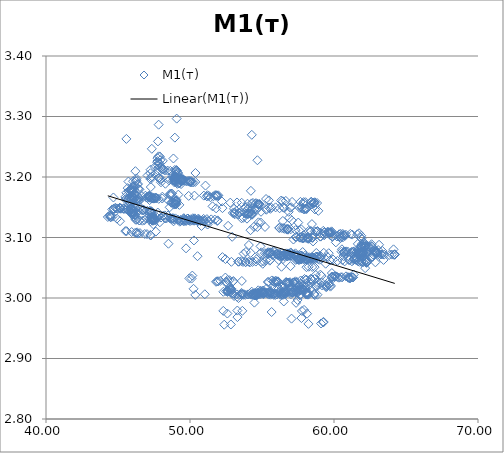
| Category | M1(т) |
|---|---|
| 47.4782104492188 | 1.562 |
| 47.8223304748535 | 3.286 |
| 47.7752113342285 | 3.259 |
| 47.9042015075684 | 3.234 |
| 47.7402610778809 | 3.231 |
| 47.8116455078125 | 3.234 |
| 48.1104316711426 | 3.227 |
| 47.9400024414063 | 3.228 |
| 47.7384796142578 | 3.226 |
| 47.8641319274902 | 3.222 |
| 47.5602607727051 | 3.217 |
| 47.7919654846191 | 3.214 |
| 47.781364440918 | 3.21 |
| 47.7717399597168 | 3.219 |
| 47.7270736694336 | 3.224 |
| 47.8446464538574 | 3.223 |
| 48.0068359375 | 3.216 |
| 48.050479888916 | 3.213 |
| 48.0594329833984 | 3.213 |
| 48.1505165100098 | 3.213 |
| 48.2072143554687 | 3.212 |
| 48.2895851135254 | 3.211 |
| 48.4586906433105 | 3.21 |
| 48.6342086791992 | 3.21 |
| 48.9484024047852 | 3.212 |
| 49.0168113708496 | 3.211 |
| 49.0652809143066 | 3.212 |
| 49.0998153686523 | 3.21 |
| 49.1643371582031 | 3.206 |
| 49.1435623168945 | 3.207 |
| 49.0636901855469 | 3.208 |
| 49.0284767150879 | 3.205 |
| 49.0110282897949 | 3.201 |
| 48.8953666687012 | 3.2 |
| 48.7631988525391 | 3.2 |
| 48.8496780395508 | 3.231 |
| 49.0629043579102 | 3.2 |
| 48.9026107788086 | 3.199 |
| 49.0445518493652 | 3.198 |
| 48.8951377868652 | 3.197 |
| 48.9089050292969 | 3.195 |
| 48.9595108032227 | 3.195 |
| 48.8071975708008 | 3.194 |
| 48.9327125549316 | 3.195 |
| 48.9280776977539 | 3.195 |
| 48.9840278625488 | 3.194 |
| 49.356273651123 | 3.193 |
| 49.2447624206543 | 3.19 |
| 49.3796463012695 | 3.188 |
| 49.2010536193848 | 3.19 |
| 49.1254501342773 | 3.189 |
| 49.0513496398926 | 3.192 |
| 48.9399909973145 | 3.193 |
| 48.9195175170898 | 3.193 |
| 48.9279365539551 | 3.191 |
| 49.0164527893066 | 3.199 |
| 48.9035606384277 | 3.2 |
| 48.959415435791 | 3.2 |
| 48.9569320678711 | 3.2 |
| 48.970645904541 | 3.2 |
| 49.0145683288574 | 3.2 |
| 49.0091552734375 | 3.201 |
| 49.1341705322266 | 3.2 |
| 49.0393905639648 | 3.199 |
| 49.0238456726074 | 3.199 |
| 49.0770149230957 | 3.198 |
| 49.1203880310059 | 3.197 |
| 49.1980819702148 | 3.196 |
| 49.2890129089355 | 3.196 |
| 49.3757286071777 | 3.197 |
| 49.4436988830566 | 3.198 |
| 49.4547424316406 | 3.196 |
| 49.4708824157715 | 3.195 |
| 49.5363121032715 | 3.195 |
| 49.5559425354004 | 3.195 |
| 49.5055389404297 | 3.195 |
| 49.4376907348633 | 3.195 |
| 49.3811721801758 | 3.194 |
| 49.4207344055176 | 3.194 |
| 49.4098472595215 | 3.195 |
| 49.4065170288086 | 3.195 |
| 49.3800315856934 | 3.193 |
| 49.4118156433105 | 3.194 |
| 49.4375114440918 | 3.193 |
| 49.5631294250488 | 3.195 |
| 49.6867408752441 | 3.194 |
| 49.767879486084 | 3.193 |
| 49.8697814941406 | 3.194 |
| 49.9816436767578 | 3.193 |
| 49.9530868530273 | 3.192 |
| 49.9929847717285 | 3.192 |
| 50.0226821899414 | 3.191 |
| 50.0557136535645 | 3.192 |
| 50.0783233642578 | 3.193 |
| 50.225959777832 | 3.191 |
| 50.1203804016113 | 3.191 |
| 50.3688583374023 | 3.192 |
| 49.3009796142578 | 3.19 |
| 48.2916946411133 | 3.189 |
| 48.0799255371094 | 3.167 |
| 47.1949615478516 | 3.162 |
| 46.3932838439941 | 3.162 |
| 46.2267150878906 | 3.162 |
| 46.0801200866699 | 3.161 |
| 45.6584587097168 | 3.162 |
| 45.7237091064453 | 3.161 |
| 45.512622833252 | 3.163 |
| 45.5086555480957 | 3.167 |
| 45.5705871582031 | 3.164 |
| 45.8847808837891 | 3.165 |
| 45.7056159973145 | 3.164 |
| 45.9650993347168 | 3.165 |
| 45.9528121948242 | 3.163 |
| 45.9915618896484 | 3.163 |
| 46.0976829528809 | 3.164 |
| 46.1201782226562 | 3.163 |
| 46.1548309326172 | 3.165 |
| 46.3209609985352 | 3.164 |
| 46.4409675598145 | 3.164 |
| 46.4696922302246 | 3.166 |
| 46.4750785827637 | 3.161 |
| 46.4192276000977 | 3.16 |
| 46.2676048278809 | 3.162 |
| 46.1051940917969 | 3.164 |
| 45.9094161987305 | 3.164 |
| 45.7662582397461 | 3.166 |
| 45.6726417541504 | 3.182 |
| 45.5823097229004 | 3.263 |
| 45.5822868347168 | 3.174 |
| 45.940185546875 | 3.169 |
| 45.9849090576172 | 3.169 |
| 46.125431060791 | 3.17 |
| 46.6593399047852 | 3.168 |
| 46.9014358520508 | 3.169 |
| 47.1791572570801 | 3.169 |
| 47.141918182373 | 3.169 |
| 47.2751693725586 | 3.168 |
| 47.194694519043 | 3.168 |
| 47.117301940918 | 3.168 |
| 47.0064811706543 | 3.167 |
| 46.9761505126953 | 3.166 |
| 47.1265411376953 | 3.167 |
| 47.165584564209 | 3.166 |
| 47.2649269104004 | 3.167 |
| 47.2057151794434 | 3.169 |
| 47.2673721313477 | 3.196 |
| 47.2508544921875 | 3.206 |
| 47.0558433532715 | 3.203 |
| 47.3575057983398 | 3.201 |
| 47.3483848571777 | 3.247 |
| 47.2624015808105 | 3.212 |
| 47.2885589599609 | 3.199 |
| 47.2763252258301 | 3.183 |
| 47.3505477905273 | 3.165 |
| 47.4623565673828 | 3.164 |
| 47.2427940368652 | 3.166 |
| 47.3565368652344 | 3.164 |
| 47.3791160583496 | 3.166 |
| 47.4531478881836 | 3.165 |
| 47.4929885864258 | 3.164 |
| 47.5062370300293 | 3.165 |
| 47.5931701660156 | 3.165 |
| 47.609733581543 | 3.166 |
| 47.6284523010254 | 3.165 |
| 47.6837539672852 | 3.165 |
| 47.8284950256348 | 3.164 |
| 47.9847373962402 | 3.191 |
| 47.8206405639648 | 3.198 |
| 47.8614234924316 | 3.198 |
| 47.9656066894531 | 3.197 |
| 47.9424209594727 | 3.195 |
| 48.5491218566895 | 3.194 |
| 45.723876953125 | 3.192 |
| 46.2806358337402 | 3.198 |
| 46.280143737793 | 3.195 |
| 46.2488632202148 | 3.193 |
| 46.0441093444824 | 3.193 |
| 46.3506774902344 | 3.188 |
| 46.1235466003418 | 3.185 |
| 46.0420608520508 | 3.184 |
| 46.0992088317871 | 3.183 |
| 46.0402336120605 | 3.148 |
| 46.2011680603027 | 3.148 |
| 45.900806427002 | 3.148 |
| 45.8478126525879 | 3.148 |
| 45.8785591125488 | 3.148 |
| 45.9586944580078 | 3.148 |
| 45.9668121337891 | 3.147 |
| 45.7226867675781 | 3.145 |
| 45.7290000915527 | 3.145 |
| 46.0446853637695 | 3.147 |
| 45.8310966491699 | 3.178 |
| 45.8725700378418 | 3.179 |
| 45.8075790405273 | 3.179 |
| 46.158748626709 | 3.178 |
| 45.8046264648438 | 3.179 |
| 46.0127754211426 | 3.178 |
| 45.7367706298828 | 3.177 |
| 45.7855682373047 | 3.176 |
| 45.9415588378906 | 3.175 |
| 45.9371376037598 | 3.178 |
| 45.9643325805664 | 3.176 |
| 46.1790885925293 | 3.172 |
| 46.0075492858887 | 3.141 |
| 46.0605316162109 | 3.143 |
| 46.1288414001465 | 3.143 |
| 46.4083595275879 | 3.144 |
| 46.0458106994629 | 3.143 |
| 45.95654296875 | 3.142 |
| 45.9712371826172 | 3.141 |
| 45.9434242248535 | 3.142 |
| 45.8794708251953 | 3.141 |
| 45.9677391052246 | 3.142 |
| 45.9633445739746 | 3.142 |
| 45.8872032165527 | 3.142 |
| 45.9403915405273 | 3.159 |
| 45.9013938903809 | 3.149 |
| 45.9834289550781 | 3.138 |
| 46.0261077880859 | 3.14 |
| 46.0449104309082 | 3.139 |
| 46.0827369689941 | 3.136 |
| 46.1400604248047 | 3.137 |
| 46.1583480834961 | 3.138 |
| 46.2024955749512 | 3.137 |
| 46.1784248352051 | 3.132 |
| 46.2221984863281 | 3.129 |
| 46.2881278991699 | 3.129 |
| 46.4824523925781 | 3.128 |
| 46.4966697692871 | 3.128 |
| 46.6974792480469 | 3.128 |
| 46.837589263916 | 3.129 |
| 47.255054473877 | 3.127 |
| 47.3602447509766 | 3.129 |
| 47.3875999450684 | 3.128 |
| 47.5115814208984 | 3.129 |
| 47.3148040771484 | 3.13 |
| 47.6245613098145 | 3.129 |
| 47.4356155395508 | 3.128 |
| 47.4749298095703 | 3.129 |
| 47.4811706542969 | 3.13 |
| 47.5076332092285 | 3.131 |
| 47.342472076416 | 3.13 |
| 47.3932151794434 | 3.132 |
| 47.4111595153809 | 3.131 |
| 47.5329170227051 | 3.133 |
| 47.3060073852539 | 3.133 |
| 47.2988319396973 | 3.134 |
| 47.2112197875977 | 3.137 |
| 47.3534049987793 | 3.139 |
| 47.3408737182617 | 3.143 |
| 47.2760353088379 | 3.143 |
| 47.290111541748 | 3.142 |
| 47.2710456848145 | 3.143 |
| 47.2861595153809 | 3.144 |
| 47.1999664306641 | 3.144 |
| 47.0336380004883 | 3.144 |
| 46.8026924133301 | 3.145 |
| 46.748477935791 | 3.146 |
| 46.7597808837891 | 3.146 |
| 46.712890625 | 3.145 |
| 46.6139755249023 | 3.146 |
| 46.5441589355469 | 3.15 |
| 46.4913101196289 | 3.18 |
| 46.4308319091797 | 3.18 |
| 46.3988189697266 | 3.181 |
| 46.3826217651367 | 3.189 |
| 46.2098388671875 | 3.21 |
| 46.1046600341797 | 3.178 |
| 45.9199180603027 | 3.179 |
| 45.9117813110352 | 3.175 |
| 45.781005859375 | 3.147 |
| 45.611873626709 | 3.147 |
| 45.5595207214355 | 3.147 |
| 45.4293518066406 | 3.147 |
| 45.3930130004883 | 3.148 |
| 45.3766479492188 | 3.147 |
| 45.2061347961426 | 3.148 |
| 45.1097259521484 | 3.149 |
| 44.9825744628906 | 3.147 |
| 45.1079597473145 | 3.149 |
| 45.1456909179687 | 3.148 |
| 45.1812515258789 | 3.149 |
| 45.1032752990723 | 3.149 |
| 44.9560966491699 | 3.148 |
| 44.8150405883789 | 3.149 |
| 44.7259101867676 | 3.147 |
| 44.8541870117188 | 3.148 |
| 44.6962127685547 | 3.147 |
| 44.5991058349609 | 3.146 |
| 44.6818542480469 | 3.166 |
| 44.6246070861816 | 3.135 |
| 44.5092239379883 | 3.134 |
| 44.4721450805664 | 3.134 |
| 44.4773101806641 | 3.137 |
| 44.4309883117676 | 3.137 |
| 44.4160804748535 | 3.135 |
| 44.2916946411133 | 3.134 |
| 44.9247627258301 | 3.131 |
| 45.1387901306152 | 3.127 |
| 45.5079345703125 | 3.111 |
| 45.6002082824707 | 3.11 |
| 45.9474830627441 | 3.109 |
| 46.1877250671387 | 3.108 |
| 46.3301010131836 | 3.109 |
| 46.2837371826172 | 3.108 |
| 46.5262107849121 | 3.107 |
| 46.3789482116699 | 3.106 |
| 46.8571815490723 | 3.106 |
| 47.0124168395996 | 3.106 |
| 47.2487411499023 | 3.104 |
| 47.2706031799316 | 3.103 |
| 47.6290588378906 | 3.11 |
| 47.7657737731934 | 3.141 |
| 47.8003768920898 | 3.136 |
| 48.2457466125488 | 3.137 |
| 48.1321296691895 | 3.136 |
| 48.4697113037109 | 3.136 |
| 48.3576011657715 | 3.131 |
| 48.5100631713867 | 3.161 |
| 48.5863609313965 | 3.15 |
| 48.6989669799805 | 3.158 |
| 48.7305755615234 | 3.158 |
| 48.7977447509766 | 3.158 |
| 48.8743782043457 | 3.157 |
| 48.9799575805664 | 3.155 |
| 49.0201454162598 | 3.155 |
| 48.8683662414551 | 3.154 |
| 49.2624702453613 | 3.154 |
| 48.9498748779297 | 3.155 |
| 49.0651206970215 | 3.155 |
| 48.9854545593262 | 3.156 |
| 48.9980773925781 | 3.158 |
| 49.031379699707 | 3.159 |
| 49.0271682739258 | 3.161 |
| 49.0509452819824 | 3.16 |
| 49.075122833252 | 3.162 |
| 49.0890617370605 | 3.204 |
| 49.0762748718262 | 3.297 |
| 48.9491424560547 | 3.265 |
| 48.7358627319336 | 3.172 |
| 48.7342987060547 | 3.172 |
| 48.6296577453613 | 3.173 |
| 48.6122665405273 | 3.171 |
| 48.0701103210449 | 3.164 |
| 48.6720924377441 | 3.169 |
| 49.1900482177734 | 3.171 |
| 49.9073028564453 | 3.169 |
| 50.3060646057129 | 3.169 |
| 51.1738815307617 | 3.168 |
| 51.3053398132324 | 3.169 |
| 51.8630180358887 | 3.169 |
| 50.9618682861328 | 3.169 |
| 51.7980003356934 | 3.169 |
| 51.9646797180176 | 3.17 |
| 51.7495651245117 | 3.17 |
| 51.9320640563965 | 3.169 |
| 51.8450202941895 | 3.17 |
| 51.6319274902344 | 3.168 |
| 51.4219436645508 | 3.167 |
| 51.2107124328613 | 3.17 |
| 51.0759429931641 | 3.186 |
| 50.3788223266602 | 3.207 |
| 47.2013397216797 | 3.141 |
| 48.9919395446777 | 3.132 |
| 48.8567161560059 | 3.127 |
| 49.2892417907715 | 3.126 |
| 49.6769714355469 | 3.13 |
| 50.6555671691895 | 3.129 |
| 50.7278327941895 | 3.127 |
| 51.0354461669922 | 3.128 |
| 50.9298248291016 | 3.128 |
| 50.7816162109375 | 3.128 |
| 50.4515113830566 | 3.128 |
| 49.9103736877441 | 3.129 |
| 49.9230651855469 | 3.128 |
| 49.1578826904297 | 3.129 |
| 49.346981048584 | 3.129 |
| 49.1587219238281 | 3.129 |
| 48.7436485290527 | 3.131 |
| 48.8786201477051 | 3.13 |
| 48.6892356872559 | 3.131 |
| 48.5823936462402 | 3.132 |
| 48.223991394043 | 3.133 |
| 47.9829711914063 | 3.133 |
| 47.7403945922852 | 3.132 |
| 47.4386978149414 | 3.133 |
| 47.3333549499512 | 3.134 |
| 47.457160949707 | 3.132 |
| 47.6239624023438 | 3.13 |
| 47.9048233032227 | 3.125 |
| 47.4526405334473 | 3.122 |
| 47.5276222229004 | 3.13 |
| 46.9756050109863 | 3.131 |
| 47.1920509338379 | 3.13 |
| 47.4232788085937 | 3.132 |
| 47.4127540588379 | 3.132 |
| 48.281551361084 | 3.132 |
| 48.7762603759766 | 3.132 |
| 48.8416938781738 | 3.132 |
| 49.5658111572266 | 3.132 |
| 49.8238792419434 | 3.131 |
| 50.3262748718262 | 3.132 |
| 50.5812225341797 | 3.131 |
| 50.9444122314453 | 3.131 |
| 51.1765899658203 | 3.13 |
| 51.473762512207 | 3.13 |
| 51.7206268310547 | 3.13 |
| 51.9245643615723 | 3.128 |
| 51.8938369750977 | 3.127 |
| 51.2842712402344 | 3.126 |
| 51.2522926330566 | 3.127 |
| 50.9364624023438 | 3.127 |
| 50.573558807373 | 3.128 |
| 50.2880325317383 | 3.128 |
| 50.1191558837891 | 3.128 |
| 50.0021095275879 | 3.127 |
| 49.6889762878418 | 3.128 |
| 49.5815734863281 | 3.129 |
| 49.4728164672852 | 3.128 |
| 49.3493194580078 | 3.127 |
| 49.5764427185059 | 3.127 |
| 49.6045112609863 | 3.13 |
| 49.5743293762207 | 3.132 |
| 49.8595695495605 | 3.131 |
| 50.1966896057129 | 3.132 |
| 50.0473022460937 | 3.13 |
| 50.3399620056152 | 3.131 |
| 50.173828125 | 3.13 |
| 50.2882385253906 | 3.13 |
| 50.3403930664063 | 3.129 |
| 50.5696487426758 | 3.129 |
| 49.7470092773438 | 3.128 |
| 50.5609741210937 | 3.127 |
| 50.2754783630371 | 3.095 |
| 50.1610794067383 | 3.037 |
| 49.9550819396973 | 3.032 |
| 50.1099243164063 | 3.032 |
| 49.7251586914063 | 3.082 |
| 50.4470405578613 | 3.128 |
| 51.5640106201172 | 3.152 |
| 52.2218246459961 | 3.159 |
| 52.796703338623 | 3.158 |
| 53.2655715942383 | 3.158 |
| 53.5891609191895 | 3.157 |
| 53.9929733276367 | 3.156 |
| 54.271671295166 | 3.156 |
| 54.3704681396484 | 3.157 |
| 54.5441360473633 | 3.156 |
| 54.5790061950684 | 3.157 |
| 54.6987342834473 | 3.156 |
| 54.7808074951172 | 3.155 |
| 54.8178024291992 | 3.156 |
| 54.814266204834 | 3.155 |
| 54.802619934082 | 3.155 |
| 54.7728233337402 | 3.155 |
| 54.7382354736328 | 3.155 |
| 54.6818084716797 | 3.228 |
| 54.2914237976074 | 3.27 |
| 54.2267761230469 | 3.177 |
| 53.9575080871582 | 3.131 |
| 53.7060241699219 | 3.133 |
| 53.5766296386719 | 3.132 |
| 53.4465484619141 | 3.141 |
| 53.3247337341309 | 3.138 |
| 53.1013526916504 | 3.138 |
| 53.2213821411133 | 3.144 |
| 52.9735374450684 | 3.141 |
| 53.1030654907227 | 3.141 |
| 53.4085388183594 | 3.141 |
| 53.798641204834 | 3.14 |
| 53.9057006835937 | 3.139 |
| 53.9890632629395 | 3.139 |
| 54.1187133789063 | 3.14 |
| 54.3423118591309 | 3.138 |
| 54.3001594543457 | 3.138 |
| 54.2422637939453 | 3.139 |
| 54.2430763244629 | 3.139 |
| 54.1353225708008 | 3.14 |
| 54.0675277709961 | 3.139 |
| 54.1364440917969 | 3.14 |
| 54.2366180419922 | 3.146 |
| 54.1801605224609 | 3.144 |
| 54.2023735046387 | 3.112 |
| 53.636775970459 | 2.979 |
| 53.2875213623047 | 2.979 |
| 53.2934303283691 | 2.968 |
| 53.3687858581543 | 3 |
| 52.9014129638672 | 3.008 |
| 52.8098373413086 | 3.01 |
| 52.87646484375 | 3.013 |
| 52.8562889099121 | 3.015 |
| 52.8534049987793 | 3.015 |
| 52.8054847717285 | 3.014 |
| 52.7971687316895 | 3.015 |
| 52.7065773010254 | 3.014 |
| 52.6003608703613 | 3.013 |
| 52.5784606933594 | 3.012 |
| 52.5891532897949 | 3.012 |
| 52.5976333618164 | 3.012 |
| 52.6642112731934 | 3.011 |
| 52.6020164489746 | 3.01 |
| 52.5080299377441 | 3.011 |
| 52.4567375183105 | 3.034 |
| 52.4619941711426 | 3.064 |
| 52.3172950744629 | 3.01 |
| 52.3125915527344 | 2.979 |
| 52.3766937255859 | 2.956 |
| 52.8386726379395 | 2.956 |
| 52.5945129394531 | 2.974 |
| 52.2522010803223 | 3.068 |
| 53.0953025817871 | 3.14 |
| 53.0562973022461 | 3.147 |
| 53.8182640075684 | 3.149 |
| 54.6601943969727 | 3.147 |
| 55.270809173584 | 3.147 |
| 55.5819664001465 | 3.147 |
| 56.2224197387695 | 3.148 |
| 56.45458984375 | 3.15 |
| 56.5417022705078 | 3.149 |
| 56.9538497924805 | 3.149 |
| 57.6091079711914 | 3.149 |
| 57.9898910522461 | 3.148 |
| 58.0736541748047 | 3.147 |
| 57.7571411132813 | 3.148 |
| 58.1044120788574 | 3.147 |
| 57.9506416320801 | 3.147 |
| 58.0584259033203 | 3.147 |
| 57.8884887695313 | 3.147 |
| 58.6767196655273 | 3.146 |
| 58.9127616882324 | 3.144 |
| 55.3049163818359 | 3.146 |
| 54.5306663513184 | 3.148 |
| 54.0073318481445 | 3.147 |
| 52.2546501159668 | 3.149 |
| 51.8141098022461 | 3.148 |
| 51.2193069458008 | 3.121 |
| 50.7974319458008 | 3.119 |
| 52.6465492248535 | 3.119 |
| 54.4428291320801 | 3.118 |
| 55.2083625793457 | 3.117 |
| 56.2258415222168 | 3.116 |
| 56.1901512145996 | 3.116 |
| 56.3836631774902 | 3.116 |
| 56.5009460449219 | 3.115 |
| 56.5595893859863 | 3.114 |
| 56.7742614746094 | 3.114 |
| 56.6796913146973 | 3.114 |
| 56.8221588134766 | 3.114 |
| 56.7472457885742 | 3.113 |
| 56.8115615844727 | 3.113 |
| 56.9989967346191 | 3.114 |
| 57.332820892334 | 3.112 |
| 57.5811080932617 | 3.112 |
| 57.7308883666992 | 3.114 |
| 58.2384452819824 | 3.111 |
| 58.3778610229492 | 3.111 |
| 58.4077491760254 | 3.11 |
| 58.663272857666 | 3.11 |
| 58.7464790344238 | 3.109 |
| 58.8181304931641 | 3.11 |
| 59.0575408935547 | 3.107 |
| 58.8530197143555 | 3.111 |
| 59.2578163146973 | 3.111 |
| 59.3340454101562 | 3.109 |
| 59.8261184692383 | 3.11 |
| 59.5605316162109 | 3.11 |
| 59.8685035705566 | 3.109 |
| 59.587703704834 | 3.109 |
| 59.7425880432129 | 3.108 |
| 59.6309318542481 | 3.108 |
| 59.7789688110352 | 3.108 |
| 59.6446075439453 | 3.108 |
| 59.821849822998 | 3.108 |
| 59.6524429321289 | 3.107 |
| 59.325870513916 | 3.108 |
| 60.4539756774902 | 3.106 |
| 60.3664207458496 | 3.105 |
| 60.6117782592773 | 3.106 |
| 60.6402244567871 | 3.104 |
| 60.8291969299316 | 3.105 |
| 60.75439453125 | 3.103 |
| 60.7119255065918 | 3.104 |
| 60.3546371459961 | 3.101 |
| 59.8779373168945 | 3.101 |
| 59.7641143798828 | 3.103 |
| 59.3298034667969 | 3.104 |
| 59.0797843933105 | 3.102 |
| 59.0423240661621 | 3.102 |
| 58.5076637268066 | 3.099 |
| 57.878360748291 | 3.099 |
| 57.639835357666 | 3.1 |
| 57.6092414855957 | 3.1 |
| 57.3402633666992 | 3.1 |
| 57.3757820129395 | 3.101 |
| 57.680248260498 | 3.1 |
| 57.8733558654785 | 3.099 |
| 58.0662689208984 | 3.099 |
| 58.2226867675781 | 3.1 |
| 58.2494316101074 | 3.098 |
| 58.1897583007812 | 3.098 |
| 58.1928024291992 | 3.101 |
| 57.5182456970215 | 3.125 |
| 57.0738754272461 | 3.128 |
| 56.8851547241211 | 3.133 |
| 56.4468383789063 | 3.127 |
| 55.6505546569824 | 3.149 |
| 55.2807540893555 | 3.164 |
| 55.4799880981445 | 3.161 |
| 56.3276252746582 | 3.161 |
| 56.4358558654785 | 3.16 |
| 56.6535263061523 | 3.161 |
| 57.0898551940918 | 3.159 |
| 57.6726760864258 | 3.159 |
| 57.8398895263672 | 3.157 |
| 58.0209426879883 | 3.158 |
| 57.8940925598145 | 3.159 |
| 58.4392280578613 | 3.159 |
| 58.4286117553711 | 3.159 |
| 58.3974227905273 | 3.159 |
| 58.6055488586426 | 3.156 |
| 58.5461006164551 | 3.157 |
| 58.6145782470703 | 3.157 |
| 58.6639289855957 | 3.158 |
| 58.8251686096191 | 3.157 |
| 58.4490051269531 | 3.155 |
| 58.6579322814941 | 3.152 |
| 57.7144737243652 | 3.151 |
| 57.0273818969727 | 3.15 |
| 55.9461517333984 | 3.15 |
| 55.4900283813477 | 3.15 |
| 54.737232208252 | 3.15 |
| 54.0837669372559 | 3.149 |
| 53.8386993408203 | 3.15 |
| 54.0881576538086 | 3.088 |
| 53.7238922119141 | 3.073 |
| 53.8798141479492 | 3.076 |
| 54.2118530273438 | 3.075 |
| 54.8770523071289 | 3.074 |
| 54.9505844116211 | 3.075 |
| 55.2002258300781 | 3.074 |
| 56.0764045715332 | 3.074 |
| 56.3832473754883 | 3.074 |
| 56.69677734375 | 3.074 |
| 57.3251266479492 | 3.074 |
| 57.8225746154785 | 3.076 |
| 58.771728515625 | 3.074 |
| 59.2884941101074 | 3.075 |
| 59.6353302001953 | 3.074 |
| 60.5512390136719 | 3.08 |
| 61.1375389099121 | 3.106 |
| 61.2633361816406 | 3.105 |
| 61.6250228881836 | 3.105 |
| 61.7374725341797 | 3.107 |
| 61.8502388000488 | 3.1 |
| 61.8913154602051 | 3.103 |
| 61.913013458252 | 3.098 |
| 62.0141487121582 | 3.069 |
| 61.6909713745117 | 3.061 |
| 61.5430870056152 | 3.063 |
| 61.3495063781738 | 3.064 |
| 61.4289093017578 | 3.064 |
| 61.5302925109863 | 3.063 |
| 61.3354797363281 | 3.062 |
| 61.0535087585449 | 3.063 |
| 61.0424842834473 | 3.063 |
| 60.5799140930176 | 3.063 |
| 60.2351531982422 | 3.061 |
| 59.9173164367676 | 3.035 |
| 59.2705078125 | 2.961 |
| 59.2563400268555 | 2.96 |
| 59.1032104492188 | 2.958 |
| 58.2248497009277 | 2.957 |
| 57.7389717102051 | 2.967 |
| 57.9195213317871 | 2.98 |
| 57.7732620239258 | 2.979 |
| 57.3672332763672 | 2.992 |
| 55.6682929992676 | 2.977 |
| 55.4099960327148 | 3.622 |
| 54.9652900695801 | 3.739 |
| 54.6056861877441 | 3.731 |
| 54.5088310241699 | 3.453 |
| 54.625415802002 | 3.064 |
| 54.1594848632812 | 3.059 |
| 54.0761756896973 | 3.06 |
| 53.680061340332 | 3.06 |
| 52.8745079040527 | 3.06 |
| 53.3495407104492 | 3.06 |
| 53.5702247619629 | 3.061 |
| 53.3876457214355 | 3.06 |
| 53.8761177062988 | 3.059 |
| 53.8491172790527 | 3.059 |
| 54.3374443054199 | 3.06 |
| 54.5734825134277 | 3.06 |
| 54.9422874450684 | 3.06 |
| 55.1029586791992 | 3.06 |
| 55.2853927612305 | 3.062 |
| 55.5381851196289 | 3.062 |
| 55.5675506591797 | 3.063 |
| 56.1635932922363 | 3.063 |
| 56.4514083862305 | 3.064 |
| 55.8229446411133 | 3.078 |
| 55.836669921875 | 3.076 |
| 55.4282569885254 | 3.076 |
| 55.6557693481445 | 3.075 |
| 55.5695571899414 | 3.075 |
| 55.5532989501953 | 3.075 |
| 55.4085807800293 | 3.075 |
| 55.3478393554687 | 3.074 |
| 55.3581199645996 | 3.073 |
| 55.5384140014648 | 3.074 |
| 56.033576965332 | 3.073 |
| 56.2153015136719 | 3.073 |
| 56.0153350830078 | 3.073 |
| 55.7876930236816 | 3.072 |
| 55.7300186157227 | 3.071 |
| 55.7105751037598 | 3.071 |
| 56.0815124511719 | 3.072 |
| 56.7292060852051 | 3.072 |
| 56.8649978637695 | 3.071 |
| 56.9388771057129 | 3.072 |
| 56.9309158325195 | 3.072 |
| 57.5247611999512 | 3.071 |
| 57.1846122741699 | 3.072 |
| 57.2136116027832 | 3.071 |
| 57.2305297851562 | 3.071 |
| 57.0012969970703 | 3.07 |
| 57.1636505126953 | 3.072 |
| 56.9916763305664 | 3.07 |
| 56.9667053222656 | 3.074 |
| 56.9146766662598 | 3.072 |
| 56.8062324523926 | 3.074 |
| 56.8718414306641 | 3.071 |
| 56.4951171875 | 3.071 |
| 56.3837432861328 | 3.07 |
| 56.4902763366699 | 3.07 |
| 56.1052665710449 | 3.071 |
| 56.3112754821777 | 3.07 |
| 56.4707984924316 | 3.071 |
| 56.7386894226074 | 3.07 |
| 56.7495536804199 | 3.069 |
| 56.1929779052734 | 3.07 |
| 56.3737297058105 | 3.069 |
| 56.3386650085449 | 3.069 |
| 56.2834587097168 | 3.068 |
| 56.5695991516113 | 3.069 |
| 56.6014137268066 | 3.073 |
| 57.0011749267578 | 3.075 |
| 56.7713508605957 | 3.072 |
| 56.8839874267578 | 3.07 |
| 56.7653846740723 | 3.069 |
| 56.9931755065918 | 3.069 |
| 57.4247016906738 | 3.068 |
| 57.3423461914063 | 3.071 |
| 57.3014907836914 | 3.07 |
| 57.7052574157715 | 3.07 |
| 57.8076286315918 | 3.069 |
| 57.9786071777344 | 3.07 |
| 58.150260925293 | 3.068 |
| 57.7864837646484 | 3.068 |
| 58.2709274291992 | 3.067 |
| 58.8800392150879 | 3.068 |
| 58.7906723022461 | 3.069 |
| 59.0972633361816 | 3.068 |
| 59.5324096679688 | 3.068 |
| 58.7679290771484 | 3.069 |
| 58.4842758178711 | 3.068 |
| 59.0156478881836 | 3.067 |
| 58.5964431762695 | 3.067 |
| 58.4866981506348 | 3.067 |
| 58.8242416381836 | 3.067 |
| 58.6157073974609 | 3.065 |
| 58.3076934814453 | 3.065 |
| 58.7022132873535 | 3.065 |
| 58.5526275634766 | 3.064 |
| 58.4527397155762 | 3.065 |
| 58.1327438354492 | 3.064 |
| 57.7172470092773 | 3.064 |
| 57.5981788635254 | 3.064 |
| 57.5648536682129 | 3.063 |
| 57.5044631958008 | 3.064 |
| 57.3470764160156 | 3.063 |
| 57.3937759399414 | 3.064 |
| 57.4754981994629 | 3.065 |
| 57.6540107727051 | 3.064 |
| 57.7629928588867 | 3.064 |
| 57.8101119995117 | 3.065 |
| 57.903434753418 | 3.064 |
| 58.0349807739258 | 3.065 |
| 58.0237770080566 | 3.066 |
| 58.1866226196289 | 3.065 |
| 58.241382598877 | 3.064 |
| 58.122917175293 | 3.063 |
| 57.9742279052734 | 3.065 |
| 57.4836692810059 | 3.065 |
| 57.5296669006348 | 3.066 |
| 57.6564025878906 | 3.064 |
| 57.7387504577637 | 3.064 |
| 58.3956718444824 | 3.064 |
| 58.9021987915039 | 3.064 |
| 58.9983901977539 | 3.063 |
| 59.4208717346191 | 3.057 |
| 59.7207260131836 | 3.062 |
| 60.7378616333008 | 3.06 |
| 61.2460899353027 | 3.061 |
| 61.7710914611816 | 3.06 |
| 61.6741104125977 | 3.061 |
| 62.036792755127 | 3.059 |
| 62.2424774169922 | 3.06 |
| 62.2590103149414 | 3.058 |
| 62.1446914672852 | 3.06 |
| 61.9154167175293 | 3.061 |
| 62.3232612609863 | 3.06 |
| 62.8731689453125 | 3.059 |
| 62.3220596313477 | 3.061 |
| 62.1789321899414 | 3.061 |
| 62.2348899841309 | 3.059 |
| 62.2377471923828 | 3.059 |
| 62.16455078125 | 3.049 |
| 57.7273902893066 | 3.07 |
| 48.5026397705078 | 3.09 |
| 50.5230674743652 | 3.069 |
| 50.245433807373 | 3.015 |
| 50.3673706054687 | 3.005 |
| 53.0615692138672 | 3.003 |
| 53.2785835266113 | 3.002 |
| 54.4718551635742 | 2.992 |
| 56.5138206481934 | 2.994 |
| 56.1071243286133 | 3.018 |
| 56.746654510498 | 3.023 |
| 56.8275146484375 | 3.025 |
| 57.1919136047363 | 3.025 |
| 56.900318145752 | 3.025 |
| 56.767520904541 | 3.025 |
| 56.6628837585449 | 3.026 |
| 55.9202117919922 | 3.026 |
| 56.1373558044434 | 3.026 |
| 56.6780090332031 | 3.027 |
| 57.3230018615723 | 3.028 |
| 58.084644317627 | 3.03 |
| 58.4423637390137 | 3.031 |
| 58.643684387207 | 3.031 |
| 58.4489097595215 | 3.031 |
| 58.390926361084 | 3.032 |
| 57.9536476135254 | 3.031 |
| 58.0439529418945 | 3.03 |
| 58.4663734436035 | 3.122 |
| 58.5469245910644 | 3.094 |
| 57.4708061218262 | 2.997 |
| 57.6291656494141 | 3.004 |
| 57.8117599487305 | 3.015 |
| 57.8799095153809 | 3.015 |
| 57.655158996582 | 3.014 |
| 57.4735221862793 | 3.013 |
| 57.6585693359375 | 3.013 |
| 57.5553741455078 | 3.013 |
| 57.6846046447754 | 3.013 |
| 57.6134033203125 | 3.013 |
| 57.428466796875 | 3.013 |
| 57.6904945373535 | 3.014 |
| 57.9682121276855 | 3.013 |
| 57.8877983093262 | 3.013 |
| 56.9548721313477 | 3.013 |
| 56.5726585388184 | 3.011 |
| 56.5408134460449 | 3.012 |
| 55.8242225646973 | 3.016 |
| 55.3193550109863 | 3.016 |
| 54.7420768737793 | 3.013 |
| 54.8987655639648 | 3.011 |
| 55.1062469482422 | 3.012 |
| 54.8986549377441 | 3.085 |
| 54.9114379882812 | 3.125 |
| 54.7528800964355 | 3.125 |
| 54.9309463500977 | 3.143 |
| 55.0547256469727 | 3.057 |
| 54.8768730163574 | 3.011 |
| 55.0351219177246 | 3.012 |
| 54.964038848877 | 3.009 |
| 54.9981651306152 | 3.009 |
| 55.1045188903809 | 3.008 |
| 55.1633834838867 | 3.009 |
| 55.1906089782715 | 3.008 |
| 55.1206359863281 | 3.009 |
| 54.858226776123 | 3.009 |
| 54.8016777038574 | 3.007 |
| 55.0743865966797 | 3.008 |
| 55.0991859436035 | 3.007 |
| 55.3822059631348 | 3.008 |
| 55.5387802124023 | 3.008 |
| 55.6477279663086 | 3.008 |
| 55.722728729248 | 3.007 |
| 55.4828834533691 | 3.009 |
| 55.57958984375 | 3.008 |
| 55.3636016845703 | 3.008 |
| 54.9936103820801 | 3.008 |
| 54.7011184692383 | 3.008 |
| 54.4876441955566 | 3.008 |
| 54.2864608764648 | 3.01 |
| 54.1471977233887 | 3.007 |
| 54.491397857666 | 3.006 |
| 54.3900413513184 | 3.006 |
| 53.8360862731934 | 3.005 |
| 54.0140724182129 | 3.006 |
| 54.0109939575195 | 3.006 |
| 54.3550415039063 | 3.007 |
| 54.3007125854492 | 3.006 |
| 54.7925720214844 | 3.007 |
| 55.0987205505371 | 3.006 |
| 54.5462036132812 | 3.007 |
| 54.2562484741211 | 3.006 |
| 54.5475082397461 | 3.007 |
| 54.4306259155273 | 3.005 |
| 54.5516967773438 | 3.006 |
| 54.5555801391602 | 3.006 |
| 54.6141891479492 | 3.005 |
| 54.6595687866211 | 3.005 |
| 54.6318969726562 | 3.008 |
| 54.6606407165527 | 3.005 |
| 54.6213645935059 | 3.005 |
| 54.5147705078125 | 3.004 |
| 54.3888244628906 | 3.006 |
| 54.9152603149414 | 3.007 |
| 55.8122711181641 | 3.007 |
| 56.4532470703125 | 3.005 |
| 55.8677368164063 | 3.007 |
| 51.0283050537109 | 3.006 |
| 52.9763259887695 | 3.007 |
| 53.4563941955566 | 3.006 |
| 53.575382232666 | 3.006 |
| 53.6410293579102 | 3.006 |
| 53.7396659851074 | 3.006 |
| 53.2616539001465 | 3.006 |
| 53.7017402648926 | 3.005 |
| 54.3424644470215 | 3.005 |
| 54.5936164855957 | 3.006 |
| 55.8178024291992 | 3.005 |
| 56.384765625 | 3.008 |
| 56.8584403991699 | 3.01 |
| 56.4827270507812 | 3.008 |
| 56.3179092407227 | 3.011 |
| 56.4693222045898 | 3.016 |
| 56.8861465454102 | 3.021 |
| 56.8537139892578 | 3.142 |
| 56.9781036376953 | 3.053 |
| 57.0960922241211 | 3.009 |
| 56.9517974853516 | 3.009 |
| 57.132381439209 | 3.01 |
| 57.5577163696289 | 3.011 |
| 57.4964218139648 | 3.01 |
| 57.3693771362305 | 3.011 |
| 57.0617942810059 | 3.009 |
| 56.6300849914551 | 3.01 |
| 56.4368286132812 | 3.009 |
| 56.5530586242676 | 3.01 |
| 56.4020347595215 | 3.01 |
| 57.3737144470215 | 3.009 |
| 57.1687240600586 | 3.01 |
| 57.2287406921387 | 3.01 |
| 58.0341644287109 | 3.008 |
| 58.0566520690918 | 3.009 |
| 58.1105308532715 | 3.009 |
| 58.1238479614258 | 3.007 |
| 57.983154296875 | 3.019 |
| 58.0410499572754 | 3.015 |
| 56.6484107971191 | 3.007 |
| 57.0116424560547 | 3.006 |
| 56.7531051635742 | 3.011 |
| 56.4407844543457 | 3.006 |
| 56.274055480957 | 3.005 |
| 55.593433380127 | 3.005 |
| 55.4579772949219 | 3.006 |
| 55.9242401123047 | 3.005 |
| 56.2736701965332 | 3.007 |
| 56.3751983642578 | 3.005 |
| 56.0390930175781 | 3.006 |
| 56.558235168457 | 3.007 |
| 57.6467475891113 | 3.005 |
| 58.0675582885742 | 3.006 |
| 58.1367835998535 | 3.007 |
| 58.6246147155762 | 3.007 |
| 58.8490943908691 | 3.005 |
| 58.6631736755371 | 3.005 |
| 58.643196105957 | 3.007 |
| 58.2597389221191 | 3.006 |
| 58.1935997009277 | 3.005 |
| 58.1294288635254 | 2.974 |
| 58.2012901306152 | 3.008 |
| 58.0588493347168 | 3.023 |
| 57.6864738464355 | 3.029 |
| 57.9031867980957 | 3.022 |
| 58.3933334350586 | 3.066 |
| 58.057975769043 | 3.064 |
| 58.2849388122559 | 3.065 |
| 59.0585670471191 | 3.069 |
| 60.6561050415039 | 3.069 |
| 60.7585372924805 | 3.071 |
| 61.4510154724121 | 3.07 |
| 61.6981353759766 | 3.071 |
| 61.9384727478027 | 3.071 |
| 61.9517555236816 | 3.071 |
| 63.2523002624512 | 3.072 |
| 63.0348663330078 | 3.071 |
| 62.708080291748 | 3.072 |
| 63.346622467041 | 3.072 |
| 63.4810829162598 | 3.072 |
| 63.8371124267578 | 3.071 |
| 64.2163696289063 | 3.071 |
| 64.1658401489258 | 3.072 |
| 64.2190704345703 | 3.072 |
| 64.1332702636719 | 3.08 |
| 64.0117797851562 | 3.072 |
| 63.4415054321289 | 3.063 |
| 63.3590278625488 | 3.078 |
| 63.1309318542481 | 3.088 |
| 62.6094627380371 | 3.089 |
| 62.116584777832 | 3.086 |
| 62.5809745788574 | 3.086 |
| 62.6395149230957 | 3.085 |
| 62.385669708252 | 3.085 |
| 62.2072639465332 | 3.087 |
| 62.1763916015625 | 3.085 |
| 62.4310073852539 | 3.084 |
| 62.3474578857422 | 3.084 |
| 61.9244194030762 | 3.084 |
| 62.1669387817383 | 3.085 |
| 62.5081825256348 | 3.084 |
| 62.1038436889648 | 3.085 |
| 62.204418182373 | 3.086 |
| 61.929874420166 | 3.085 |
| 61.9032173156738 | 3.084 |
| 61.8615455627441 | 3.085 |
| 61.8492965698242 | 3.085 |
| 61.9053802490234 | 3.086 |
| 61.9945907592773 | 3.085 |
| 62.1267814636231 | 3.09 |
| 62.0802192687988 | 3.092 |
| 61.9267311096191 | 3.089 |
| 61.6550750732422 | 3.089 |
| 61.8561706542969 | 3.074 |
| 61.5653877258301 | 3.065 |
| 61.9096641540527 | 3.06 |
| 61.6873283386231 | 3.061 |
| 62.6860046386719 | 3.068 |
| 62.6187934875488 | 3.068 |
| 62.7626991271973 | 3.075 |
| 63.069149017334 | 3.079 |
| 62.7696762084961 | 3.078 |
| 62.8885993957519 | 3.078 |
| 62.8171920776367 | 3.077 |
| 62.9383735656738 | 3.077 |
| 62.8597946166992 | 3.077 |
| 62.9778823852539 | 3.075 |
| 63.0465812683105 | 3.074 |
| 62.9182090759277 | 3.075 |
| 62.9989356994629 | 3.074 |
| 62.9440116882324 | 3.075 |
| 62.927188873291 | 3.075 |
| 62.9126396179199 | 3.075 |
| 62.9189949035645 | 3.074 |
| 63.0138053894043 | 3.075 |
| 62.962230682373 | 3.075 |
| 62.3530540466309 | 3.073 |
| 62.2791023254394 | 3.075 |
| 62.0402069091797 | 3.075 |
| 62.0825271606445 | 3.074 |
| 62.0503883361816 | 3.075 |
| 61.9573364257812 | 3.075 |
| 62.2127990722656 | 3.075 |
| 61.6918067932129 | 3.076 |
| 61.2491493225098 | 3.076 |
| 61.5371437072754 | 3.076 |
| 61.2163505554199 | 3.075 |
| 60.8427124023437 | 3.077 |
| 60.6821250915527 | 3.076 |
| 60.6977462768555 | 3.075 |
| 60.5233917236328 | 3.077 |
| 60.8767127990723 | 3.075 |
| 60.9460067749023 | 3.077 |
| 60.6906356811523 | 3.076 |
| 61.3450088500977 | 3.076 |
| 61.3972473144531 | 3.077 |
| 61.5597229003906 | 3.076 |
| 61.7092742919922 | 3.076 |
| 61.7162818908691 | 3.075 |
| 62.0206184387207 | 3.075 |
| 61.9176483154297 | 3.075 |
| 61.8359718322754 | 3.075 |
| 61.6813125610352 | 3.076 |
| 61.828369140625 | 3.074 |
| 61.2304878234863 | 3.075 |
| 61.6687278747559 | 3.076 |
| 61.7433319091797 | 3.074 |
| 61.8826446533203 | 3.075 |
| 61.8638648986816 | 3.074 |
| 61.9013023376465 | 3.073 |
| 61.8985595703125 | 3.073 |
| 62.0603752136231 | 3.074 |
| 61.9940795898438 | 3.074 |
| 62.3526496887207 | 3.076 |
| 62.6409072875977 | 2.547 |
| 56.8423080444336 | 0.841 |
| 61.3729591369629 | 3.039 |
| 58.7340240478516 | 3.038 |
| 59.8480491638184 | 3.034 |
| 59.929069519043 | 3.064 |
| 60.1292915344238 | 3.092 |
| 59.0537071228027 | 3.039 |
| 58.2436828613281 | 3.052 |
| 58.0887794494629 | 3.051 |
| 58.486385345459 | 3.051 |
| 58.6525764465332 | 3.051 |
| 56.3545913696289 | 3.052 |
| 56.9752311706543 | 3.017 |
| 57.0527610778809 | 2.966 |
| 57.4303016662598 | 3.019 |
| 57.5605278015137 | 3.02 |
| 57.5668258666992 | 3.02 |
| 58.1200714111328 | 3.02 |
| 58.2363395690918 | 3.02 |
| 58.7581481933594 | 3.02 |
| 58.8889923095703 | 3.021 |
| 59.6220169067383 | 3.022 |
| 59.6502151489258 | 3.022 |
| 59.7553176879883 | 3.019 |
| 59.7661247253418 | 3.021 |
| 59.4380722045898 | 3.018 |
| 59.5269088745117 | 3.02 |
| 58.7515602111816 | 3.018 |
| 59.4865264892578 | 3.018 |
| 59.4360771179199 | 3.021 |
| 59.1782150268555 | 3.021 |
| 59.555908203125 | 3.025 |
| 59.1273918151855 | 3.026 |
| 58.8776206970215 | 3.025 |
| 58.3688888549805 | 3.026 |
| 57.4337844848633 | 3.026 |
| 56.9436225891113 | 3.026 |
| 56.7069435119629 | 3.025 |
| 57.1838035583496 | 3.026 |
| 57.2532272338867 | 3.026 |
| 57.365550994873 | 3.025 |
| 57.2092781066895 | 3.026 |
| 57.1637535095215 | 3.025 |
| 56.7921409606934 | 3.025 |
| 56.1150398254395 | 3.027 |
| 55.8425178527832 | 3.027 |
| 55.6844100952148 | 3.029 |
| 55.8123054504395 | 3.028 |
| 55.9501838684082 | 3.029 |
| 56.081787109375 | 3.027 |
| 56.0068283081055 | 3.028 |
| 56.0160026550293 | 3.027 |
| 55.4038848876953 | 3.026 |
| 55.469352722168 | 3.026 |
| 54.6764259338379 | 3.117 |
| 52.9294281005859 | 3.101 |
| 53.0118522644043 | 3.028 |
| 53.5988006591797 | 3.028 |
| 52.6045227050781 | 3.03 |
| 52.7444267272949 | 3.029 |
| 52.5145645141602 | 3.027 |
| 52.1064605712891 | 3.028 |
| 51.8088569641113 | 3.027 |
| 51.8782577514648 | 3.028 |
| 51.9577407836914 | 3.028 |
| 52.4725189208984 | 3.026 |
| 52.9679145812988 | 3.027 |
| 53.578182220459 | 3.008 |
| 54.7006454467773 | 3.009 |
| 55.1297760009766 | 3.009 |
| 55.307487487793 | 3.009 |
| 55.5018539428711 | 3.011 |
| 55.5843200683594 | 3.011 |
| 56.1169967651367 | 3.009 |
| 56.2081489562988 | 3.01 |
| 55.783332824707 | 3.007 |
| 56.5847473144531 | 3.007 |
| 56.4508743286133 | 3.009 |
| 56.0933151245117 | 3.014 |
| 57.1829986572266 | 3.097 |
| 57.8395080566406 | 3.1 |
| 57.7939300537109 | 3.099 |
| 57.9246406555176 | 3.1 |
| 58.1577339172363 | 3.099 |
| 58.4995918273926 | 3.099 |
| 58.4827041625977 | 3.1 |
| 59.1287002563477 | 3.037 |
| 59.9630470275879 | 3.033 |
| 60.3434143066406 | 3.034 |
| 60.2352180480957 | 3.035 |
| 60.5700988769531 | 3.034 |
| 61.2667388916016 | 3.034 |
| 61.1138572692871 | 3.032 |
| 61.0773963928223 | 3.033 |
| 61.12109375 | 3.034 |
| 61.3068199157715 | 3.034 |
| 61.3265380859375 | 3.034 |
| 61.0352668762207 | 3.033 |
| 60.9948768615723 | 3.034 |
| 60.9678268432617 | 3.035 |
| 60.8342666625977 | 3.036 |
| 60.4850234985352 | 3.034 |
| 60.1215057373047 | 3.036 |
| 60.0457305908203 | 3.035 |
| 60.0503959655762 | 3.036 |
| 59.8437690734863 | 3.035 |
| 59.8520050048828 | 3.041 |
| 59.7074584960937 | 3.108 |
| 59.3086967468262 | 3.104 |
| 59.8692207336426 | 3.102 |
| 60.203784942627 | 3.102 |
| 60.5685729980469 | 3.102 |
| 60.4443817138672 | 3.101 |
| 60.4600143432617 | 3.099 |
| 60.6008529663086 | 3.1 |